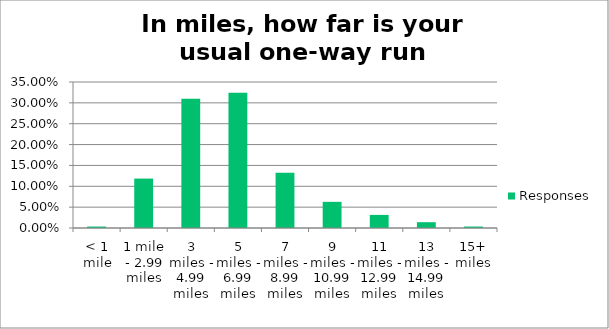
| Category | Responses |
|---|---|
| < 1 mile | 0.004 |
| 1 mile - 2.99 miles | 0.118 |
| 3 miles - 4.99 miles | 0.31 |
| 5 miles - 6.99 miles | 0.324 |
| 7 miles - 8.99 miles | 0.132 |
| 9 miles - 10.99 miles | 0.063 |
| 11 miles - 12.99 miles | 0.031 |
| 13 miles - 14.99 miles | 0.014 |
| 15+ miles | 0.004 |